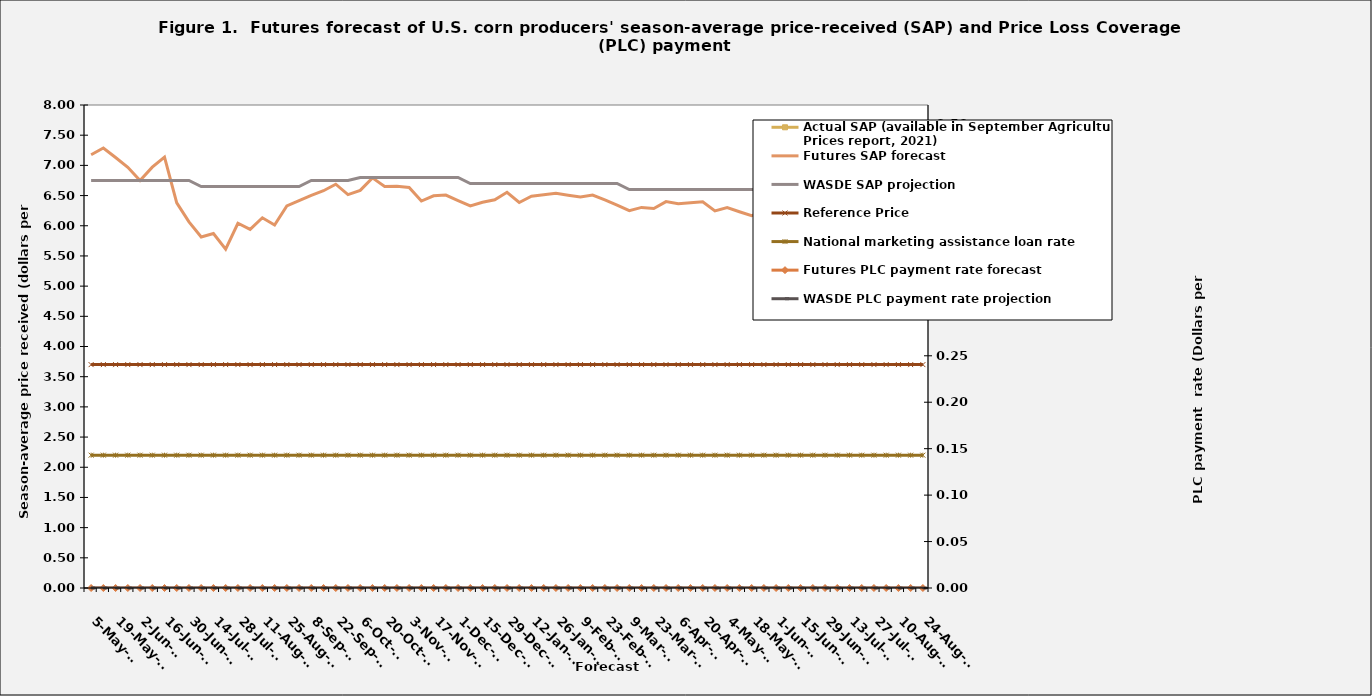
| Category | Actual SAP (available in September Agricultural Prices report, 2021) | Futures SAP forecast | WASDE SAP projection | Reference Price | National marketing assistance loan rate  |
|---|---|---|---|---|---|
| 2022-05-05 |  | 7.176 | 6.75 | 3.7 | 2.2 |
| 2022-05-12 |  | 7.288 | 6.75 | 3.7 | 2.2 |
| 2022-05-19 |  | 7.131 | 6.75 | 3.7 | 2.2 |
| 2022-05-26 |  | 6.969 | 6.75 | 3.7 | 2.2 |
| 2022-06-02 |  | 6.749 | 6.75 | 3.7 | 2.2 |
| 2022-06-09 |  | 6.971 | 6.75 | 3.7 | 2.2 |
| 2022-06-16 |  | 7.137 | 6.75 | 3.7 | 2.2 |
| 2022-06-23 |  | 6.38 | 6.75 | 3.7 | 2.2 |
| 2022-06-30 |  | 6.064 | 6.75 | 3.7 | 2.2 |
| 2022-07-07 |  | 5.814 | 6.65 | 3.7 | 2.2 |
| 2022-07-14 |  | 5.872 | 6.65 | 3.7 | 2.2 |
| 2022-07-21 |  | 5.612 | 6.65 | 3.7 | 2.2 |
| 2022-07-28 |  | 6.041 | 6.65 | 3.7 | 2.2 |
| 2022-08-04 |  | 5.939 | 6.65 | 3.7 | 2.2 |
| 2022-08-11 |  | 6.132 | 6.65 | 3.7 | 2.2 |
| 2022-08-18 |  | 6.012 | 6.65 | 3.7 | 2.2 |
| 2022-08-25 |  | 6.328 | 6.65 | 3.7 | 2.2 |
| 2022-09-01 |  | 6.415 | 6.65 | 3.7 | 2.2 |
| 2022-09-08 |  | 6.503 | 6.75 | 3.7 | 2.2 |
| 2022-09-15 |  | 6.58 | 6.75 | 3.7 | 2.2 |
| 2022-09-22 |  | 6.688 | 6.75 | 3.7 | 2.2 |
| 2022-09-29 |  | 6.517 | 6.75 | 3.7 | 2.2 |
| 2022-10-06 |  | 6.585 | 6.8 | 3.7 | 2.2 |
| 2022-10-13 |  | 6.793 | 6.8 | 3.7 | 2.2 |
| 2022-10-20 |  | 6.651 | 6.8 | 3.7 | 2.2 |
| 2022-10-27 |  | 6.653 | 6.8 | 3.7 | 2.2 |
| 2022-11-03 |  | 6.633 | 6.8 | 3.7 | 2.2 |
| 2022-11-10 |  | 6.409 | 6.8 | 3.7 | 2.2 |
| 2022-11-17 |  | 6.496 | 6.8 | 3.7 | 2.2 |
| 2022-11-24 |  | 6.509 | 6.8 | 3.7 | 2.2 |
| 2022-12-01 |  | 6.417 | 6.8 | 3.7 | 2.2 |
| 2022-12-08 |  | 6.328 | 6.7 | 3.7 | 2.2 |
| 2022-12-15 |  | 6.389 | 6.7 | 3.7 | 2.2 |
| 2022-12-22 |  | 6.43 | 6.7 | 3.7 | 2.2 |
| 2022-12-29 |  | 6.555 | 6.7 | 3.7 | 2.2 |
| 2023-01-05 |  | 6.385 | 6.7 | 3.7 | 2.2 |
| 2023-01-12 |  | 6.489 | 6.7 | 3.7 | 2.2 |
| 2023-01-19 |  | 6.514 | 6.7 | 3.7 | 2.2 |
| 2023-01-26 |  | 6.537 | 6.7 | 3.7 | 2.2 |
| 2023-02-02 |  | 6.505 | 6.7 | 3.7 | 2.2 |
| 2023-02-09 |  | 6.478 | 6.7 | 3.7 | 2.2 |
| 2023-02-16 |  | 6.509 | 6.7 | 3.7 | 2.2 |
| 2023-02-23 |  | 6.428 | 6.7 | 3.7 | 2.2 |
| 2023-03-02 |  | 6.341 | 6.7 | 3.7 | 2.2 |
| 2023-03-09 |  | 6.249 | 6.6 | 3.7 | 2.2 |
| 2023-03-16 |  | 6.304 | 6.6 | 3.7 | 2.2 |
| 2023-03-23 |  | 6.285 | 6.6 | 3.7 | 2.2 |
| 2023-03-30 |  | 6.4 | 6.6 | 3.7 | 2.2 |
| 2023-04-06 |  | 6.365 | 6.6 | 3.7 | 2.2 |
| 2023-04-13 |  | 6.379 | 6.6 | 3.7 | 2.2 |
| 2023-04-20 |  | 6.396 | 6.6 | 3.7 | 2.2 |
| 2023-04-27 |  | 6.246 | 6.6 | 3.7 | 2.2 |
| 2023-05-04 |  | 6.3 | 6.6 | 3.7 | 2.2 |
| 2023-05-11 |  | 6.232 | 6.6 | 3.7 | 2.2 |
| 2023-05-18 |  | 6.168 | 6.6 | 3.7 | 2.2 |
| 2023-05-25 |  | 6.238 | 6.6 | 3.7 | 2.2 |
| 2023-06-01 |  | 6.318 | 4.8 | 3.7 | 2.2 |
| 2023-06-08 |  | 6.348 | 4.8 | 3.7 | 2.2 |
| 2023-06-15 |  | 6.423 | 4.8 | 3.7 | 2.2 |
| 2023-06-22 |  | 6.538 | 4.8 | 3.7 | 2.2 |
| 2023-06-29 |  | 6.301 | 4.8 | 3.7 | 2.2 |
| 2023-07-06 |  | 6.314 | 4.8 | 3.7 | 2.2 |
| 2023-07-13 |  | 6.328 | 4.8 | 3.7 | 2.2 |
| 2023-07-20 |  | 6.404 | 4.8 | 3.7 | 2.2 |
| 2023-07-27 |  | 6.398 | 4.8 | 3.7 | 2.2 |
| 2023-08-03 |  | 6.37 | 4.8 | 3.7 | 2.2 |
| 2023-08-10 |  | 6.373 | 4.9 | 3.7 | 2.2 |
| 2023-08-17 |  | 6.359 | 4.9 | 3.7 | 2.2 |
| 2023-08-24 |  | 6.358 | 4.9 | 3.7 | 2.2 |